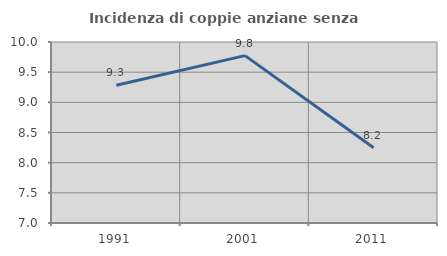
| Category | Incidenza di coppie anziane senza figli  |
|---|---|
| 1991.0 | 9.283 |
| 2001.0 | 9.774 |
| 2011.0 | 8.247 |